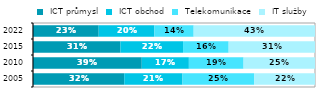
| Category |  ICT průmysl |  ICT obchod |  Telekomunikace |  IT služby  |
|---|---|---|---|---|
| 2005.0 | 0.324 | 0.207 | 0.254 | 0.216 |
| 2010.0 | 0.386 | 0.167 | 0.194 | 0.253 |
| 2015.0 | 0.31 | 0.222 | 0.162 | 0.306 |
| 2022.0 | 0.233 | 0.198 | 0.139 | 0.43 |